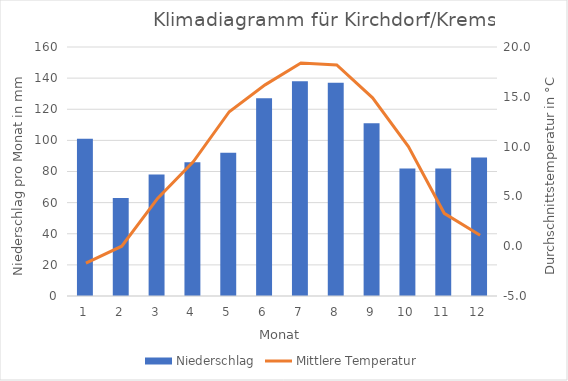
| Category | Niederschlag |
|---|---|
| 0 | 101 |
| 1 | 63 |
| 2 | 78 |
| 3 | 86 |
| 4 | 92 |
| 5 | 127 |
| 6 | 138 |
| 7 | 137 |
| 8 | 111 |
| 9 | 82 |
| 10 | 82 |
| 11 | 89 |